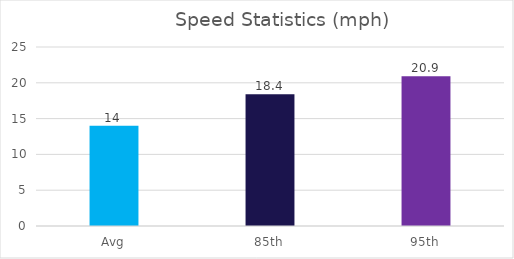
| Category | Series 0 |
|---|---|
| Avg | 14 |
| 85th | 18.4 |
| 95th | 20.9 |